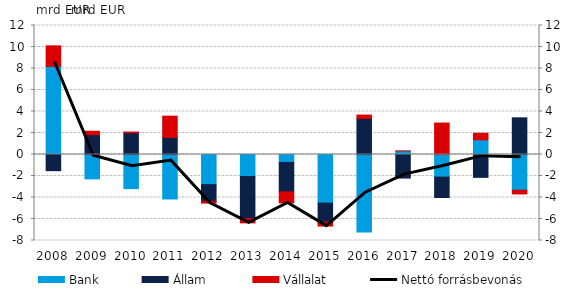
| Category | Bank | Állam  | Vállalat |
|---|---|---|---|
| 2008.0 | 8.199 | -1.505 | 1.907 |
| 2009.0 | -2.269 | 1.843 | 0.318 |
| 2010.0 | -3.173 | 2.021 | 0.066 |
| 2011.0 | -4.137 | 1.588 | 1.979 |
| 2012.0 | -2.805 | -1.54 | -0.177 |
| 2013.0 | -2.046 | -3.904 | -0.41 |
| 2014.0 | -0.735 | -2.748 | -1.014 |
| 2015.0 | -4.524 | -1.766 | -0.367 |
| 2016.0 | -7.217 | 3.354 | 0.315 |
| 2017.0 | 0.324 | -2.193 | 0.003 |
| 2018.0 | -2.102 | -1.896 | 2.925 |
| 2019.0 | 1.366 | -2.126 | 0.608 |
| 2020.0 | -3.327 | 3.412 | -0.342 |